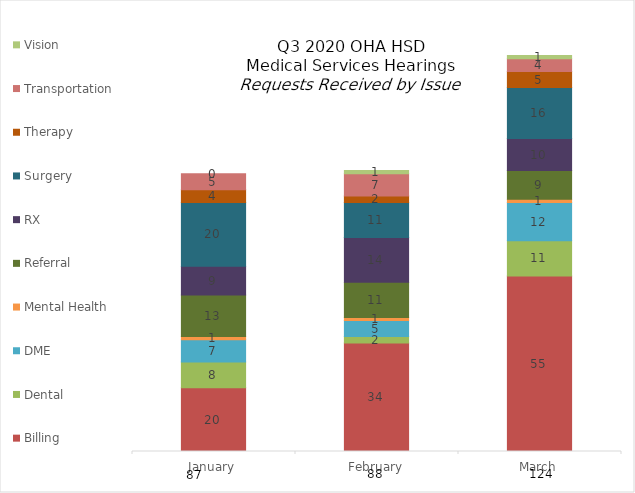
| Category | Billing | Dental | DME | Mental Health | Referral | RX | Surgery | Therapy | Transportation | Vision |
|---|---|---|---|---|---|---|---|---|---|---|
| January | 20 | 8 | 7 | 1 | 13 | 9 | 20 | 4 | 5 | 0 |
| February | 34 | 2 | 5 | 1 | 11 | 14 | 11 | 2 | 7 | 1 |
| March | 55 | 11 | 12 | 1 | 9 | 10 | 16 | 5 | 4 | 1 |